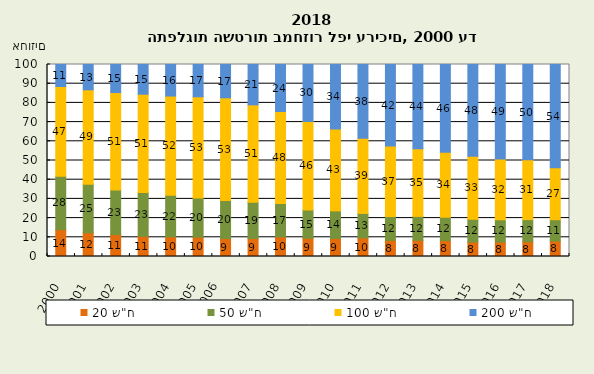
| Category | 20 ש"ח  | 50 ש"ח  | 100 ש"ח  | 200 ש"ח  |
|---|---|---|---|---|
| 2000 | 13.988 | 27.76 | 46.807 | 11.445 |
| 2001 | 12.35 | 25.34 | 49.122 | 13.188 |
| 2002 | 11.415 | 23.223 | 50.759 | 14.603 |
| 2003 | 10.512 | 22.79 | 51.213 | 15.484 |
| 2004 | 10.232 | 21.661 | 51.683 | 16.425 |
| 2005 | 10.069 | 20.392 | 52.725 | 16.814 |
| 2006
 | 9.351 | 19.859 | 53.441 | 17.349 |
| 2007 | 9.384 | 18.931 | 50.669 | 21.015 |
| 2008 | 10.209 | 17.432 | 47.875 | 24.484 |
| 2009 | 9.486 | 14.672 | 46.168 | 29.674 |
| 2010 | 9.417 | 14.353 | 42.636 | 33.593 |
| 2011 | 9.699 | 12.73 | 39.169 | 38.401 |
| 2012 | 8.417 | 12.388 | 36.742 | 42.453 |
| 2013 | 8.418 | 12.464 | 35.192 | 43.926 |
| 2014 | 8.261 | 12.196 | 33.887 | 45.657 |
| 2015 | 7.556 | 11.833 | 32.83 | 47.782 |
| 2016 | 7.526 | 11.598 | 31.605 | 49.271 |
| 2017 | 7.686 | 11.528 | 31.123 | 49.664 |
| 2018 | 8 | 11.167 | 27 | 54 |